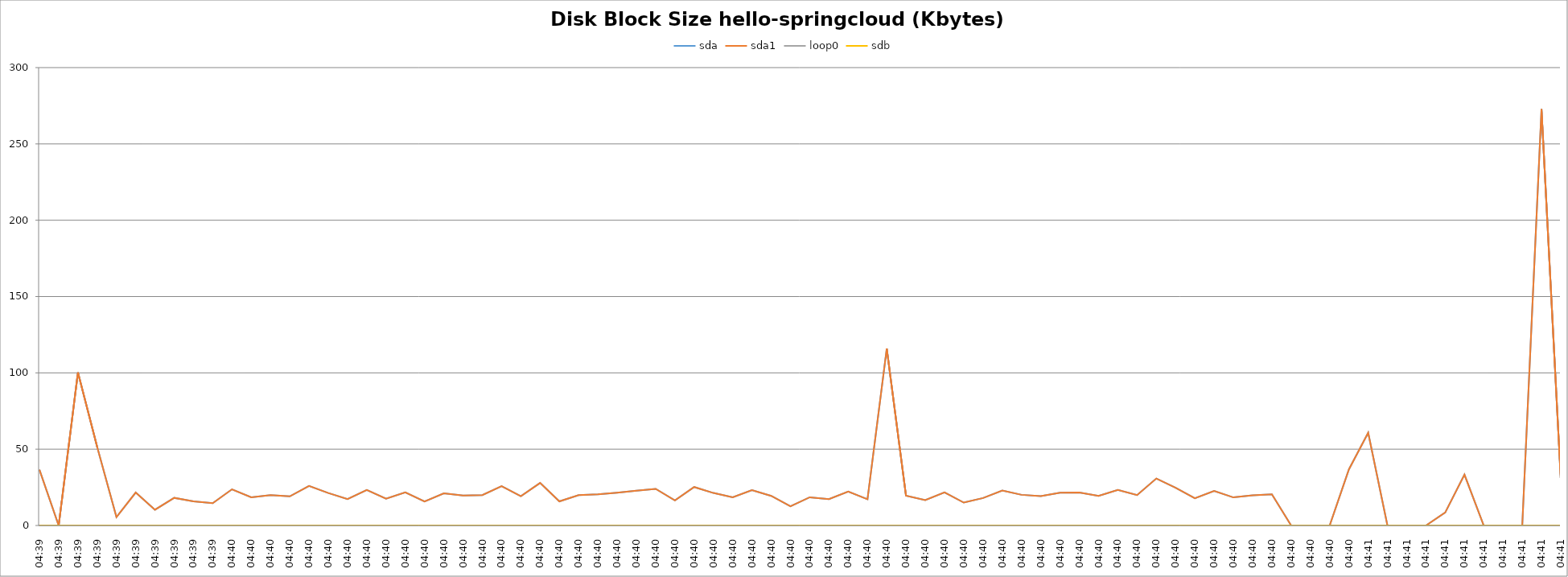
| Category | sda | sda1 | loop0 | sdb |
|---|---|---|---|---|
| 04:39 | 36.6 | 36.6 | 0 | 0 |
| 04:39 | 0 | 0 | 0 | 0 |
| 04:39 | 100.3 | 100.3 | 0 | 0 |
| 04:39 | 51.4 | 51.4 | 0 | 0 |
| 04:39 | 5.5 | 5.5 | 0 | 0 |
| 04:39 | 21.6 | 21.6 | 0 | 0 |
| 04:39 | 10.3 | 10.3 | 0 | 0 |
| 04:39 | 18.1 | 18.1 | 0 | 0 |
| 04:39 | 15.8 | 15.8 | 0 | 0 |
| 04:39 | 14.6 | 14.6 | 0 | 0 |
| 04:40 | 23.7 | 23.7 | 0 | 0 |
| 04:40 | 18.5 | 18.5 | 0 | 0 |
| 04:40 | 19.9 | 19.9 | 0 | 0 |
| 04:40 | 19.1 | 19.1 | 0 | 0 |
| 04:40 | 25.9 | 25.9 | 0 | 0 |
| 04:40 | 21.3 | 21.3 | 0 | 0 |
| 04:40 | 17.3 | 17.3 | 0 | 0 |
| 04:40 | 23.3 | 23.3 | 0 | 0 |
| 04:40 | 17.6 | 17.6 | 0 | 0 |
| 04:40 | 21.7 | 21.7 | 0 | 0 |
| 04:40 | 15.7 | 15.7 | 0 | 0 |
| 04:40 | 21.1 | 21.1 | 0 | 0 |
| 04:40 | 19.7 | 19.7 | 0 | 0 |
| 04:40 | 19.9 | 19.9 | 0 | 0 |
| 04:40 | 25.8 | 25.8 | 0 | 0 |
| 04:40 | 19.2 | 19.2 | 0 | 0 |
| 04:40 | 27.9 | 27.9 | 0 | 0 |
| 04:40 | 15.8 | 15.8 | 0 | 0 |
| 04:40 | 19.9 | 19.9 | 0 | 0 |
| 04:40 | 20.4 | 20.4 | 0 | 0 |
| 04:40 | 21.5 | 21.5 | 0 | 0 |
| 04:40 | 22.8 | 22.8 | 0 | 0 |
| 04:40 | 24 | 24 | 0 | 0 |
| 04:40 | 16.4 | 16.4 | 0 | 0 |
| 04:40 | 25.2 | 25.2 | 0 | 0 |
| 04:40 | 21.3 | 21.3 | 0 | 0 |
| 04:40 | 18.5 | 18.5 | 0 | 0 |
| 04:40 | 23.2 | 23.2 | 0 | 0 |
| 04:40 | 19.4 | 19.4 | 0 | 0 |
| 04:40 | 12.6 | 12.6 | 0 | 0 |
| 04:40 | 18.5 | 18.5 | 0 | 0 |
| 04:40 | 17.3 | 17.3 | 0 | 0 |
| 04:40 | 22.2 | 22.2 | 0 | 0 |
| 04:40 | 17.2 | 17.2 | 0 | 0 |
| 04:40 | 115.9 | 115.9 | 0 | 0 |
| 04:40 | 19.5 | 19.5 | 0 | 0 |
| 04:40 | 16.6 | 16.6 | 0 | 0 |
| 04:40 | 21.7 | 21.7 | 0 | 0 |
| 04:40 | 15 | 15 | 0 | 0 |
| 04:40 | 18 | 18 | 0 | 0 |
| 04:40 | 22.9 | 22.9 | 0 | 0 |
| 04:40 | 20.1 | 20.1 | 0 | 0 |
| 04:40 | 19.3 | 19.3 | 0 | 0 |
| 04:40 | 21.5 | 21.5 | 0 | 0 |
| 04:40 | 21.6 | 21.6 | 0 | 0 |
| 04:40 | 19.4 | 19.4 | 0 | 0 |
| 04:40 | 23.3 | 23.3 | 0 | 0 |
| 04:40 | 19.9 | 19.9 | 0 | 0 |
| 04:40 | 30.8 | 30.8 | 0 | 0 |
| 04:40 | 24.7 | 24.7 | 0 | 0 |
| 04:40 | 17.8 | 17.8 | 0 | 0 |
| 04:40 | 22.6 | 22.6 | 0 | 0 |
| 04:40 | 18.4 | 18.4 | 0 | 0 |
| 04:40 | 19.8 | 19.8 | 0 | 0 |
| 04:40 | 20.4 | 20.4 | 0 | 0 |
| 04:40 | 0 | 0 | 0 | 0 |
| 04:40 | 0 | 0 | 0 | 0 |
| 04:40 | 0 | 0 | 0 | 0 |
| 04:40 | 36.8 | 36.8 | 0 | 0 |
| 04:41 | 60.8 | 60.8 | 0 | 0 |
| 04:41 | 0 | 0 | 0 | 0 |
| 04:41 | 0 | 0 | 0 | 0 |
| 04:41 | 0 | 0 | 0 | 0 |
| 04:41 | 8.5 | 8.5 | 0 | 0 |
| 04:41 | 33.3 | 33.3 | 0 | 0 |
| 04:41 | 0 | 0 | 0 | 0 |
| 04:41 | 0 | 0 | 0 | 0 |
| 04:41 | 0 | 0 | 0 | 0 |
| 04:41 | 272.8 | 272.8 | 0 | 0 |
| 04:41 | 30.7 | 30.7 | 0 | 0 |